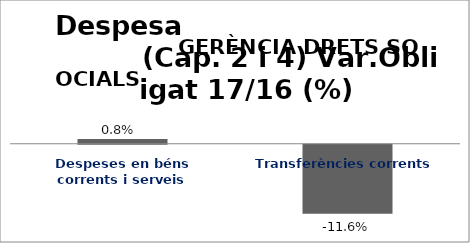
| Category | Series 0 |
|---|---|
| Despeses en béns corrents i serveis | 0.008 |
| Transferències corrents | -0.116 |